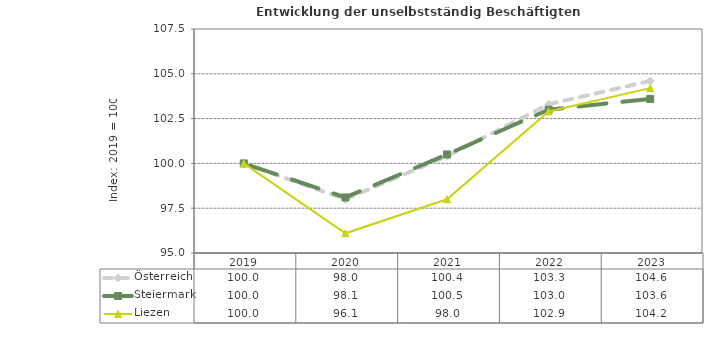
| Category | Österreich | Steiermark | Liezen |
|---|---|---|---|
| 2023.0 | 104.6 | 103.6 | 104.2 |
| 2022.0 | 103.3 | 103 | 102.9 |
| 2021.0 | 100.4 | 100.5 | 98 |
| 2020.0 | 98 | 98.1 | 96.1 |
| 2019.0 | 100 | 100 | 100 |